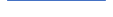
| Category | Series 0 |
|---|---|
| 0 | 17 |
| 1 | 1 |
| 2 | 12 |
| 3 | 8 |
| 4 | 9 |
| 5 | 6 |
| 6 | 8 |
| 7 | 11 |
| 8 | 8 |